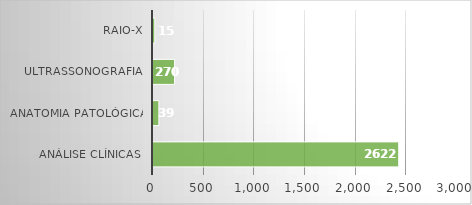
| Category | Series 0 |
|---|---|
| Análise Clínicas  | 2425 |
| Anatomia Patológica | 58 |
| Ultrassonografia  | 213 |
| RAIO-X | 18 |